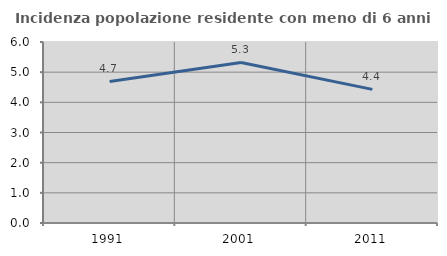
| Category | Incidenza popolazione residente con meno di 6 anni |
|---|---|
| 1991.0 | 4.691 |
| 2001.0 | 5.32 |
| 2011.0 | 4.429 |